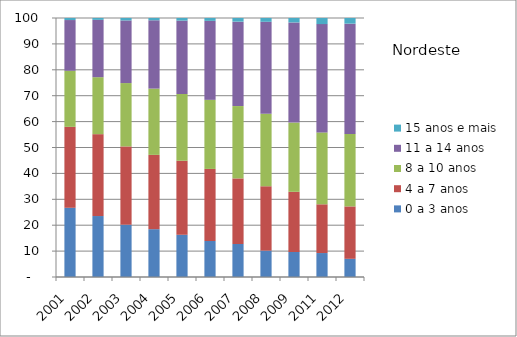
| Category | 0 a 3 anos | 4 a 7 anos | 8 a 10 anos | 11 a 14 anos | 15 anos e mais |
|---|---|---|---|---|---|
| 2001 | 26.72 | 31.25 | 21.65 | 19.59 | 0.79 |
| 2002 | 23.54 | 31.61 | 22 | 22.13 | 0.73 |
| 2003 | 20.19 | 30.23 | 24.46 | 24.18 | 0.95 |
| 2004 | 18.47 | 28.68 | 25.59 | 26.38 | 0.88 |
| 2005 | 16.3 | 28.58 | 25.77 | 28.34 | 1 |
| 2006 | 13.9 | 27.83 | 26.67 | 30.49 | 1.11 |
| 2007 | 12.74 | 25.33 | 27.93 | 32.59 | 1.41 |
| 2008 | 10.18 | 24.86 | 27.99 | 35.51 | 1.46 |
| 2009 | 9.65 | 23.24 | 26.72 | 38.68 | 1.72 |
| 2011 | 9.25 | 18.82 | 27.75 | 41.82 | 2.35 |
| 2012 | 7.02 | 20.24 | 27.98 | 42.57 | 2.2 |